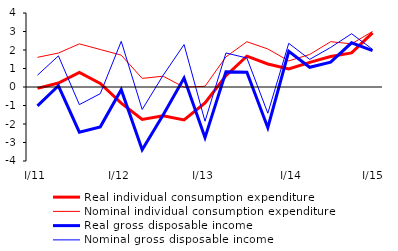
| Category | Real individual consumption expenditure | Nominal individual consumption expenditure | Real gross disposable income | Nominal gross disposable income  |
|---|---|---|---|---|
| I/11 | -0.073 | 1.604 | -1.022 | 0.639 |
| II | 0.216 | 1.835 | 0.065 | 1.682 |
| III | 0.793 | 2.331 | -2.44 | -0.952 |
| IV | 0.189 | 2.026 | -2.154 | -0.36 |
| I/12 | -0.873 | 1.721 | -0.145 | 2.468 |
| II | -1.753 | 0.466 | -3.396 | -1.214 |
| III | -1.553 | 0.584 | -1.509 | 0.629 |
| IV | -1.781 | -0.012 | 0.483 | 2.294 |
| I/13 | -0.862 | 0.04 | -2.735 | -1.851 |
| II | 0.613 | 1.63 | 0.82 | 1.839 |
| III | 1.666 | 2.447 | 0.792 | 1.567 |
|  IV | 1.242 | 2.055 | -2.203 | -1.417 |
|   I/14 | 0.979 | 1.411 | 1.926 | 2.362 |
| II | 1.33 | 1.759 | 1.067 | 1.494 |
| III | 1.648 | 2.449 | 1.34 | 2.139 |
| IV | 1.843 | 2.334 | 2.386 | 2.88 |
|  I/15 | 2.928 | 3.001 | 1.964 | 2.036 |